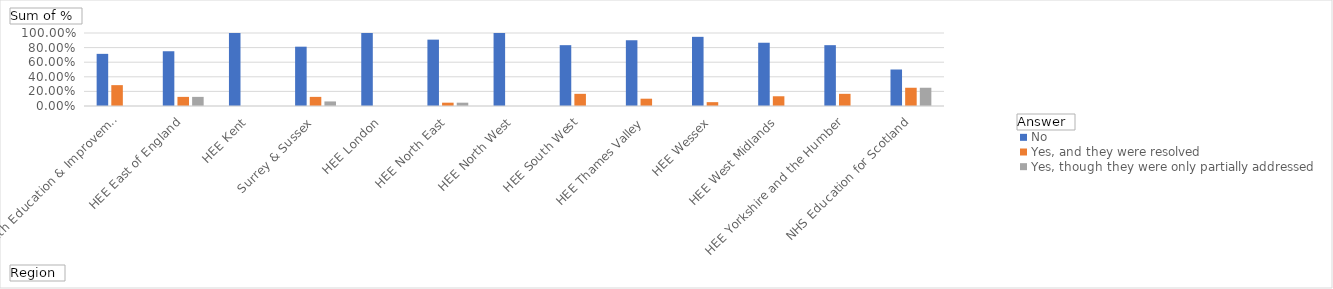
| Category | No | Yes, and they were resolved | Yes, though they were only partially addressed |
|---|---|---|---|
| Health Education & Improvement Wales | 0.714 | 0.286 | 0 |
| HEE East of England | 0.75 | 0.125 | 0.125 |
| HEE Kent, Surrey & Sussex | 1 | 0 | 0 |
| HEE London | 0.812 | 0.125 | 0.062 |
| HEE North East | 1 | 0 | 0 |
| HEE North West | 0.909 | 0.045 | 0.045 |
| HEE South West | 1 | 0 | 0 |
| HEE Thames Valley | 0.833 | 0.167 | 0 |
| HEE Wessex | 0.9 | 0.1 | 0 |
| HEE West Midlands | 0.947 | 0.053 | 0 |
| HEE Yorkshire and the Humber | 0.867 | 0.133 | 0 |
| NHS Education for Scotland | 0.833 | 0.167 | 0 |
| Northern Ireland Medical & Dental Training Agency | 0.5 | 0.25 | 0.25 |